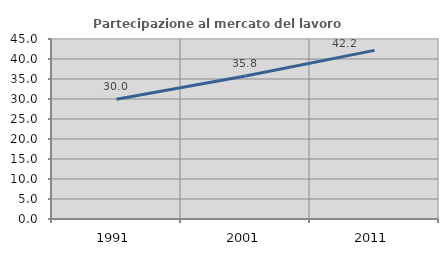
| Category | Partecipazione al mercato del lavoro  femminile |
|---|---|
| 1991.0 | 29.959 |
| 2001.0 | 35.76 |
| 2011.0 | 42.157 |